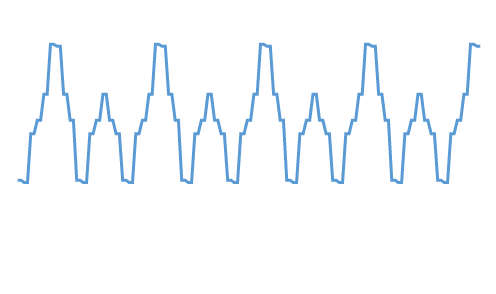
| Category | Series 0 |
|---|---|
| 0.0 | 58.995 |
| 4.86 | 58.995 |
| 6.12 | 58.922 |
| 11.67 | 58.922 |
| 20.77 | 60.404 |
| 22.37 | 60.404 |
| 25.630000000000003 | 60.811 |
| 29.110000000000003 | 60.811 |
| 34.06 | 61.602 |
| 37.510000000000005 | 61.602 |
| 50.11000000000001 | 63.11 |
| 54.56000000000001 | 63.11 |
| 55.56000000000001 | 63.053 |
| 59.56000000000001 | 63.053 |
| 72.16000000000001 | 61.602 |
| 76.71000000000001 | 61.602 |
| 81.74000000000001 | 60.811 |
| 83.75000000000001 | 60.811 |
| 93.73000000000002 | 58.995 |
| 98.71000000000002 | 58.995 |
| 99.97000000000003 | 58.922 |
| 101.42000000000003 | 58.922 |
| 109.52000000000002 | 60.404 |
| 114.32000000000002 | 60.404 |
| 117.72000000000003 | 60.811 |
| 121.32000000000002 | 60.811 |
| 126.37000000000002 | 61.602 |
| 130.27 | 61.602 |
| 135.32000000000002 | 60.811 |
| 141.27 | 60.811 |
| 144.55 | 60.404 |
| 149.5 | 60.404 |
| 149.5 | 58.995 |
| 149.5 | 58.995 |
| 149.5 | 58.922 |
| 149.5 | 58.922 |
| 149.5 | 60.404 |
| 149.5 | 60.404 |
| 149.5 | 60.811 |
| 149.5 | 60.811 |
| 149.5 | 61.602 |
| 149.5 | 61.602 |
| 149.5 | 63.11 |
| 149.5 | 63.11 |
| 149.5 | 63.053 |
| 149.5 | 63.053 |
| 149.5 | 61.602 |
| 149.5 | 61.602 |
| 149.5 | 60.811 |
| 149.5 | 60.811 |
| 149.5 | 58.995 |
| 149.5 | 58.995 |
| 149.5 | 58.922 |
| 149.5 | 58.922 |
| 149.5 | 60.404 |
| 149.5 | 60.404 |
| 149.5 | 60.811 |
| 149.5 | 60.811 |
| 149.5 | 61.602 |
| 149.5 | 61.602 |
| 149.5 | 60.811 |
| 149.5 | 60.811 |
| 149.5 | 60.404 |
| 149.5 | 60.404 |
| 149.5 | 58.995 |
| 149.5 | 58.995 |
| 149.5 | 58.922 |
| 149.5 | 58.922 |
| 149.5 | 60.404 |
| 149.5 | 60.404 |
| 149.5 | 60.811 |
| 149.5 | 60.811 |
| 149.5 | 61.602 |
| 149.5 | 61.602 |
| 149.5 | 63.11 |
| 149.5 | 63.11 |
| 149.5 | 63.053 |
| 149.5 | 63.053 |
| 149.5 | 61.602 |
| 149.5 | 61.602 |
| 149.5 | 60.811 |
| 149.5 | 60.811 |
| 149.5 | 58.995 |
| 149.5 | 58.995 |
| 149.5 | 58.922 |
| 149.5 | 58.922 |
| 149.5 | 60.404 |
| 149.5 | 60.404 |
| 149.5 | 60.811 |
| 149.5 | 60.811 |
| 149.5 | 61.602 |
| 149.5 | 61.602 |
| 149.5 | 60.811 |
| 149.5 | 60.811 |
| 149.5 | 60.404 |
| 149.5 | 60.404 |
| 149.5 | 58.995 |
| 149.5 | 58.995 |
| 149.5 | 58.922 |
| 149.5 | 58.922 |
| 149.5 | 60.404 |
| 149.5 | 60.404 |
| 149.5 | 60.811 |
| 149.5 | 60.811 |
| 149.5 | 61.602 |
| 149.5 | 61.602 |
| 149.5 | 63.11 |
| 149.5 | 63.11 |
| 149.5 | 63.053 |
| 149.5 | 63.053 |
| 149.5 | 61.602 |
| 149.5 | 61.602 |
| 149.5 | 60.811 |
| 149.5 | 60.811 |
| 149.5 | 58.995 |
| 149.5 | 58.995 |
| 149.5 | 58.922 |
| 149.5 | 58.922 |
| 149.5 | 60.404 |
| 149.5 | 60.404 |
| 149.5 | 60.811 |
| 149.5 | 60.811 |
| 149.5 | 61.602 |
| 149.5 | 61.602 |
| 149.5 | 60.811 |
| 149.5 | 60.811 |
| 149.5 | 60.404 |
| 149.5 | 60.404 |
| 149.5 | 58.995 |
| 149.5 | 58.995 |
| 149.5 | 58.922 |
| 149.5 | 58.922 |
| 149.5 | 60.404 |
| 149.5 | 60.404 |
| 149.5 | 60.811 |
| 149.5 | 60.811 |
| 149.5 | 61.602 |
| 149.5 | 61.602 |
| 149.5 | 63.11 |
| 149.5 | 63.11 |
| 149.5 | 63.053 |
| 149.5 | 63.053 |